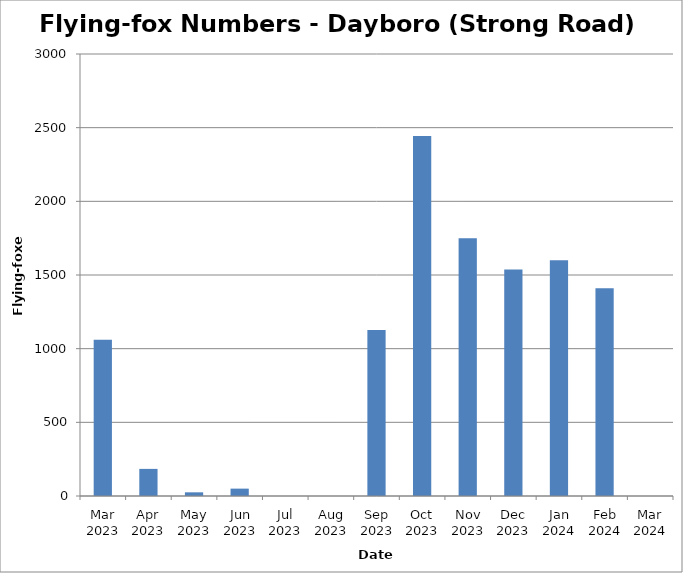
| Category | Flying-foxes |
|---|---|
| Mar 2023 | 1060 |
| Apr 2023 | 184 |
| May 2023 | 25 |
| Jun 2023 | 50 |
| Jul 2023 | 0 |
| Aug 2023 | 0 |
| Sep 2023 | 1126 |
| Oct 2023 | 2443 |
| Nov 2023 | 1749 |
| Dec 2023 | 1538 |
| Jan 2024 | 1600 |
| Feb 2024 | 1410 |
| Mar 2024 | 0 |